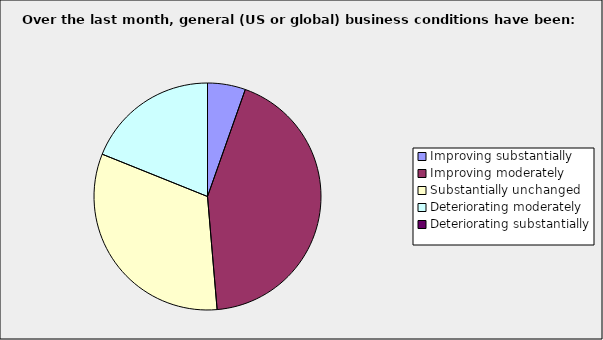
| Category | Series 0 |
|---|---|
| Improving substantially | 0.054 |
| Improving moderately | 0.432 |
| Substantially unchanged | 0.324 |
| Deteriorating moderately | 0.189 |
| Deteriorating substantially | 0 |